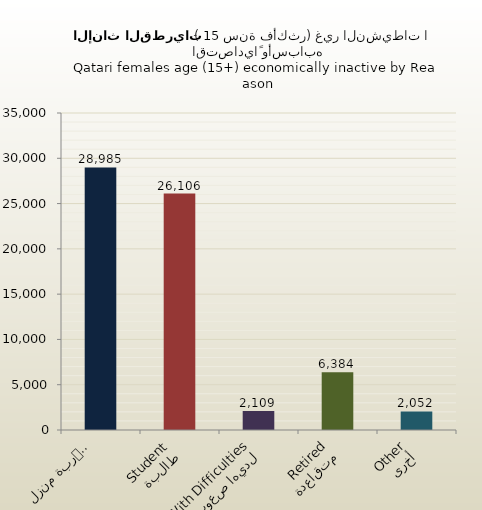
| Category | الاناث القطريات |
|---|---|
| ربة منزل
Homemaker | 28985 |
| طالبة
Student | 26106 |
| لديها صعوبات
With Difficulties | 2109 |
| متقاعدة
Retired | 6384 |
| أخرى
Other | 2052 |